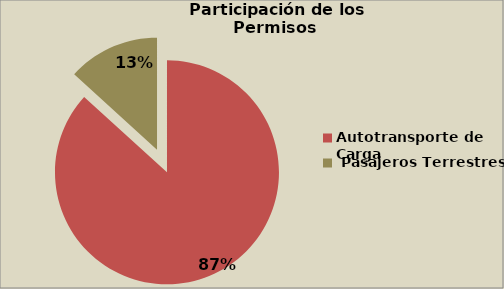
| Category | Series 0 |
|---|---|
| Autotransporte de Carga  | 86.747 |
|  Pasajeros Terrestres | 13.253 |